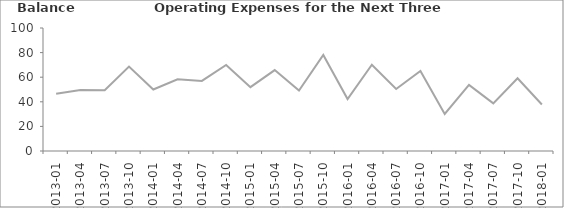
| Category | Balance |
|---|---|
| 2013-01 | 46.5 |
| 2013-04 | 49.6 |
| 2013-07 | 49.4 |
| 2013-10 | 68.6 |
| 2014-01 | 50 |
| 2014-04 | 58.3 |
| 2014-07 | 57 |
| 2014-10 | 70 |
| 2015-01 | 51.9 |
| 2015-04 | 65.8 |
| 2015-07 | 49.2 |
| 2015-10 | 78.1 |
| 2016-01 | 42.2 |
| 2016-04 | 70.1 |
| 2016-07 | 50.4 |
| 2016-10 | 65 |
| 2017-01 | 30.1 |
| 2017-04 | 53.7 |
| 2017-07 | 38.7 |
| 2017-10 | 59.1 |
| 2018-01 | 37.8 |